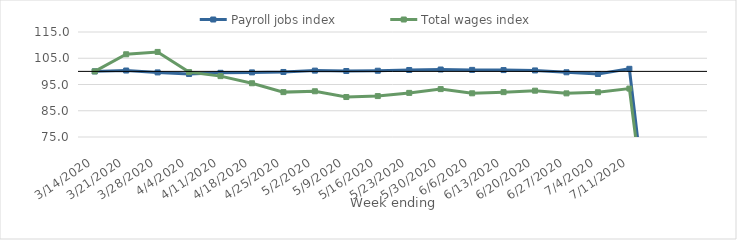
| Category | Payroll jobs index | Total wages index |
|---|---|---|
| 14/03/2020 | 100 | 100 |
| 21/03/2020 | 100.324 | 106.518 |
| 28/03/2020 | 99.606 | 107.408 |
| 04/04/2020 | 98.991 | 99.717 |
| 11/04/2020 | 99.456 | 98.195 |
| 18/04/2020 | 99.614 | 95.472 |
| 25/04/2020 | 99.769 | 92.097 |
| 02/05/2020 | 100.288 | 92.424 |
| 09/05/2020 | 100.141 | 90.228 |
| 16/05/2020 | 100.249 | 90.588 |
| 23/05/2020 | 100.526 | 91.806 |
| 30/05/2020 | 100.713 | 93.248 |
| 06/06/2020 | 100.569 | 91.647 |
| 13/06/2020 | 100.492 | 92.09 |
| 20/06/2020 | 100.361 | 92.644 |
| 27/06/2020 | 99.65 | 91.624 |
| 04/07/2020 | 99.006 | 92.048 |
| 11/07/2020 | 100.976 | 93.448 |